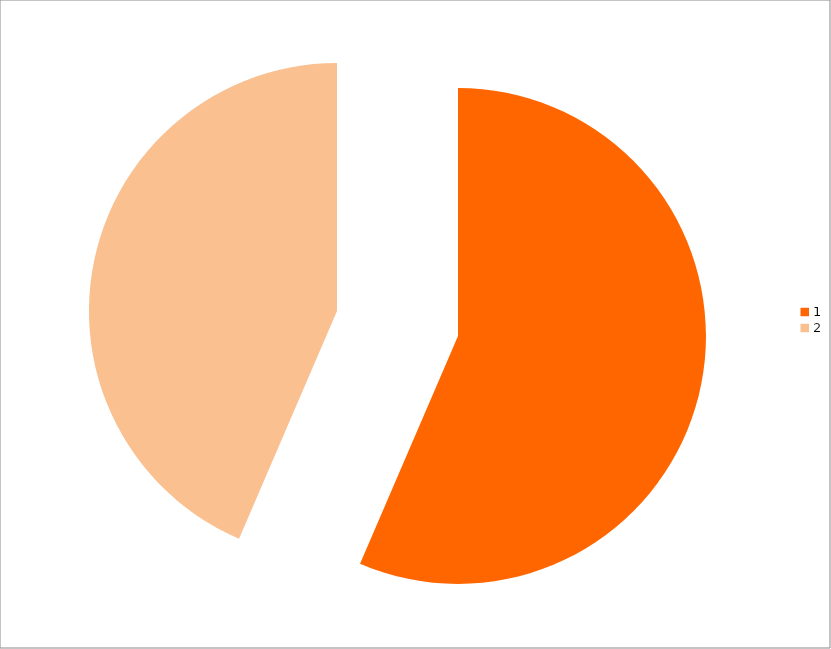
| Category | Series 0 |
|---|---|
| 0 | 83 |
| 1 | 64 |